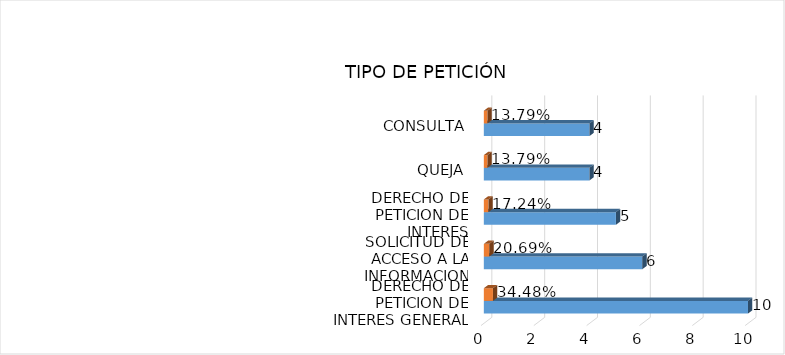
| Category | Cuenta de Número petición | Cuenta de Número petición2 |
|---|---|---|
| DERECHO DE PETICION DE INTERES GENERAL | 10 | 0.345 |
| SOLICITUD DE ACCESO A LA INFORMACION | 6 | 0.207 |
| DERECHO DE PETICION DE INTERES PARTICULAR | 5 | 0.172 |
| QUEJA | 4 | 0.138 |
| CONSULTA | 4 | 0.138 |